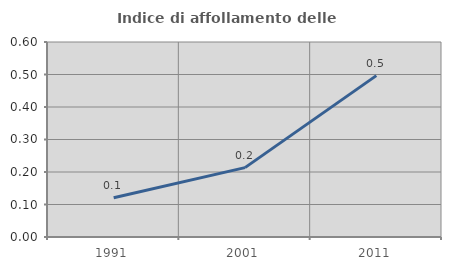
| Category | Indice di affollamento delle abitazioni  |
|---|---|
| 1991.0 | 0.121 |
| 2001.0 | 0.213 |
| 2011.0 | 0.497 |